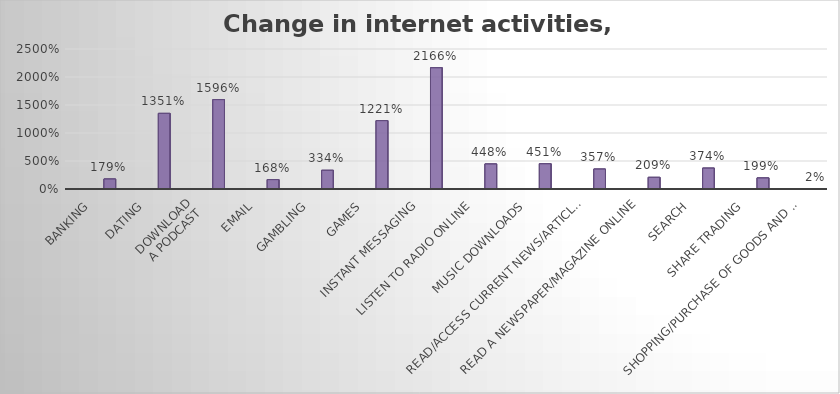
| Category | Series 0 | Series 1 | Series 2 | Series 3 |
|---|---|---|---|---|
| Banking |  |  |  | 1.79 |
| Dating |  |  |  | 13.506 |
| Download
 a podcast |  |  |  | 15.963 |
| Email |  |  |  | 1.677 |
| Gambling |  |  |  | 3.341 |
| Games |  |  |  | 12.211 |
| Instant messaging |  |  |  | 21.66 |
| Listen to radio online |  |  |  | 4.477 |
| Music downloads |  |  |  | 4.514 |
| Read/access current news/articles online |  |  |  | 3.568 |
| Read a newspaper/magazine online |  |  |  | 2.085 |
| Search |  |  |  | 3.736 |
| Share trading |  |  |  | 1.985 |
| Shopping/purchase of goods and services |  |  |  | 0.016 |